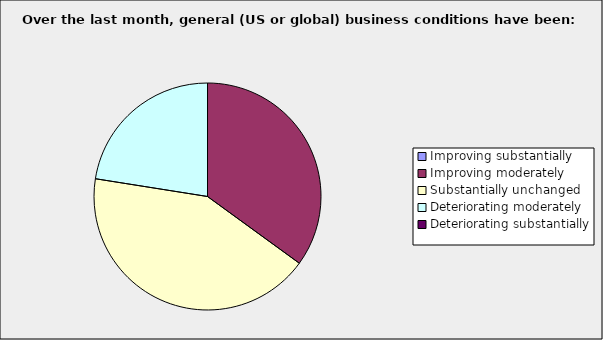
| Category | Series 0 |
|---|---|
| Improving substantially | 0 |
| Improving moderately | 0.35 |
| Substantially unchanged | 0.425 |
| Deteriorating moderately | 0.225 |
| Deteriorating substantially | 0 |